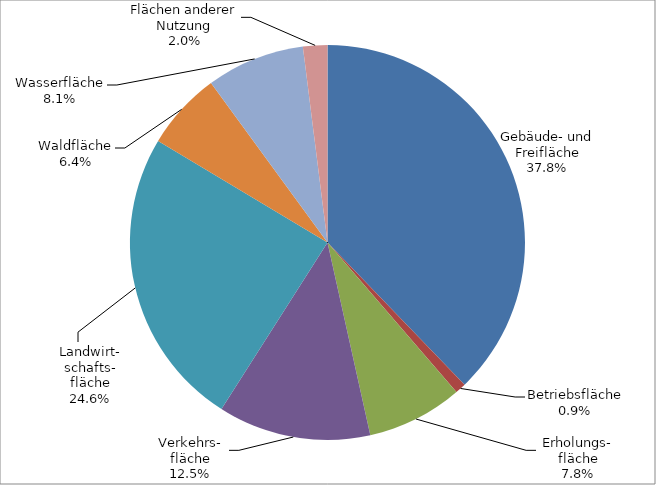
| Category | 2013 |
|---|---|
| Gebäude- und Freifläche | 28540.824 |
| Betriebsfläche | 671.298 |
| Erholungs-
fläche | 5920.565 |
| Verkehrs-
fläche | 9440.326 |
| Landwirt-
schafts-
fläche | 18559.275 |
| Waldfläche | 4806.787 |
| Wasserfläche | 6077.97 |
| Flächen anderer Nutzung | 1504.748 |